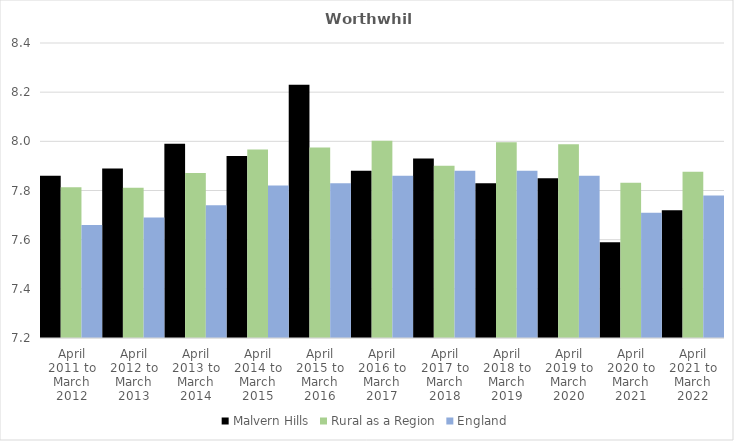
| Category | Malvern Hills | Rural as a Region | England |
|---|---|---|---|
| April 2011 to March 2012 | 7.86 | 7.813 | 7.66 |
| April 2012 to March 2013 | 7.89 | 7.811 | 7.69 |
| April 2013 to March 2014 | 7.99 | 7.871 | 7.74 |
| April 2014 to March 2015 | 7.94 | 7.967 | 7.82 |
| April 2015 to March 2016 | 8.23 | 7.975 | 7.83 |
| April 2016 to March 2017 | 7.88 | 8.002 | 7.86 |
| April 2017 to March 2018 | 7.93 | 7.9 | 7.88 |
| April 2018 to March 2019 | 7.83 | 7.996 | 7.88 |
| April 2019 to March 2020 | 7.85 | 7.988 | 7.86 |
| April 2020 to March 2021 | 7.59 | 7.831 | 7.71 |
| April 2021 to March 2022 | 7.72 | 7.877 | 7.78 |